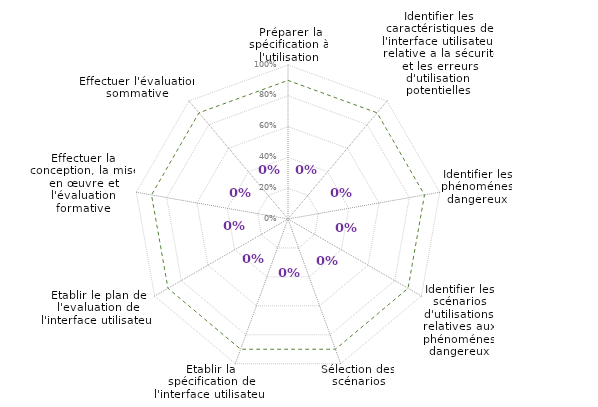
| Category | 90% | Résultats |
|---|---|---|
| 0 | 0.9 | 0 |
| 1 | 0.9 | 0 |
| 2 | 0.9 | 0 |
| 3 | 0.9 | 0 |
| 4 | 0.9 | 0 |
| 5 | 0.9 | 0 |
| 6 | 0.9 | 0 |
| 7 | 0.9 | 0 |
| 8 | 0.9 | 0 |